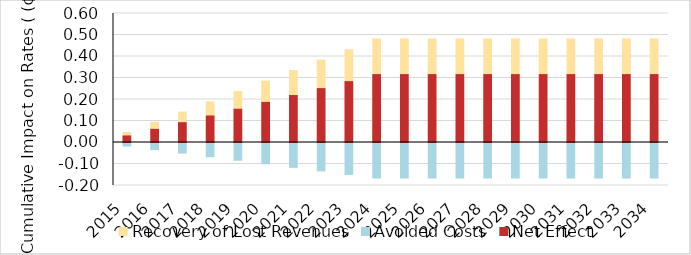
| Category | Recovery of Lost Revenues | Avoided Costs |
|---|---|---|
| 2015.0 | 0.047 | -0.017 |
| 2016.0 | 0.094 | -0.033 |
| 2017.0 | 0.142 | -0.05 |
| 2018.0 | 0.189 | -0.066 |
| 2019.0 | 0.237 | -0.083 |
| 2020.0 | 0.286 | -0.099 |
| 2021.0 | 0.334 | -0.116 |
| 2022.0 | 0.383 | -0.132 |
| 2023.0 | 0.432 | -0.149 |
| 2024.0 | 0.481 | -0.165 |
| 2025.0 | 0.481 | -0.165 |
| 2026.0 | 0.481 | -0.165 |
| 2027.0 | 0.481 | -0.165 |
| 2028.0 | 0.481 | -0.165 |
| 2029.0 | 0.481 | -0.165 |
| 2030.0 | 0.481 | -0.165 |
| 2031.0 | 0.481 | -0.165 |
| 2032.0 | 0.481 | -0.165 |
| 2033.0 | 0.481 | -0.165 |
| 2034.0 | 0.481 | -0.165 |